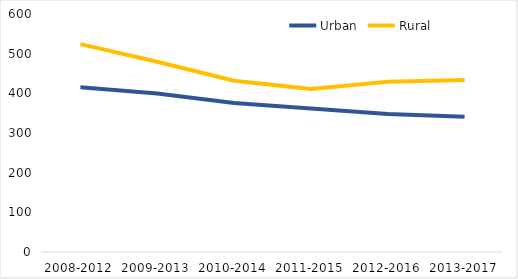
| Category | Urban | Rural |
|---|---|---|
| 2008-2012 | 415.6 | 524 |
| 2009-2013 | 399.4 | 479.8 |
| 2010-2014 | 375.8 | 431.6 |
| 2011-2015 | 361.8 | 411.2 |
| 2012-2016 | 348 | 429 |
| 2013-2017 | 340.8 | 433.8 |